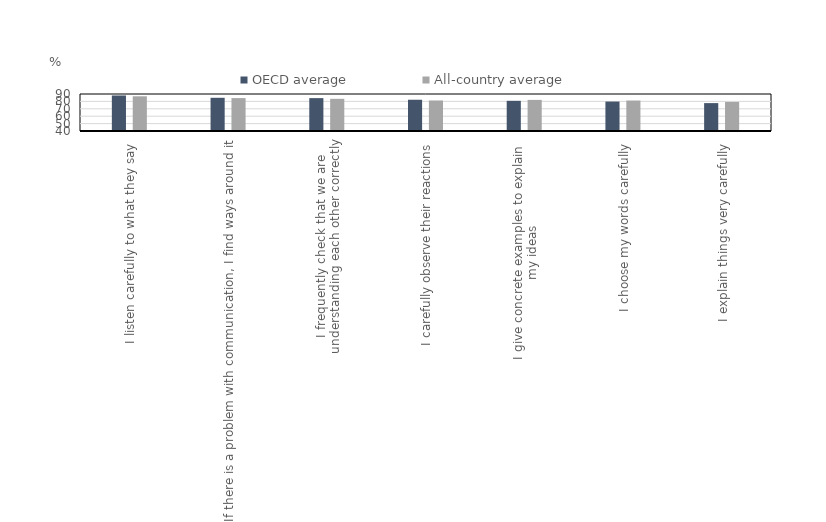
| Category | OECD average | All-country average |
|---|---|---|
| I listen carefully to what they say | 87.994 | 86.897 |
| If there is a problem with communication, I find ways around it | 84.871 | 84.47 |
| I frequently check that we are
understanding each other correctly | 84.43 | 83.485 |
| I carefully observe their reactions | 82.236 | 81.237 |
| I give concrete examples to explain
my ideas | 80.781 | 82.022 |
| I choose my words carefully | 79.788 | 81.148 |
| I explain things very carefully | 77.69 | 79.256 |